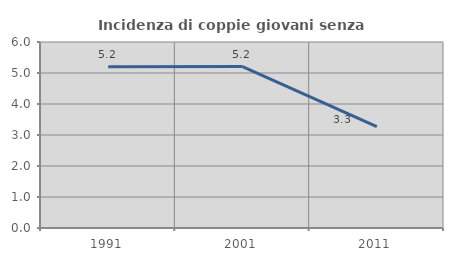
| Category | Incidenza di coppie giovani senza figli |
|---|---|
| 1991.0 | 5.204 |
| 2001.0 | 5.209 |
| 2011.0 | 3.267 |